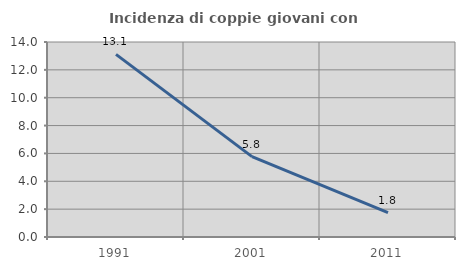
| Category | Incidenza di coppie giovani con figli |
|---|---|
| 1991.0 | 13.115 |
| 2001.0 | 5.769 |
| 2011.0 | 1.754 |